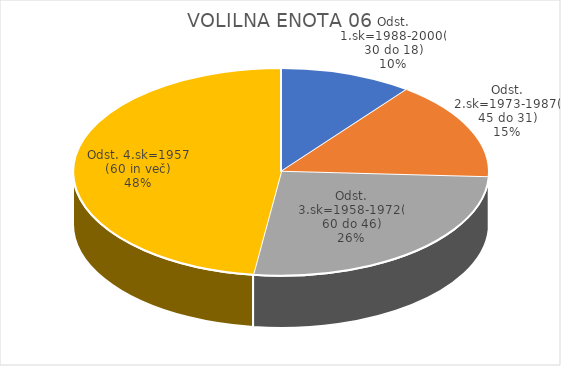
| Category | VOLILNA ENOTA 06 |
|---|---|
| Odst. 1.sk=1988-2000(30 do 18) | 1.48 |
| Odst. 2.sk=1973-1987(45 do 31) | 2.2 |
| Odst. 3.sk=1958-1972(60 do 46) | 3.75 |
| Odst. 4.sk=1957 (60 in več) | 6.82 |